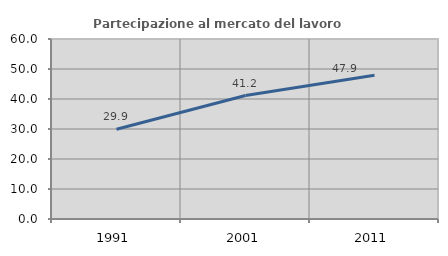
| Category | Partecipazione al mercato del lavoro  femminile |
|---|---|
| 1991.0 | 29.916 |
| 2001.0 | 41.154 |
| 2011.0 | 47.938 |